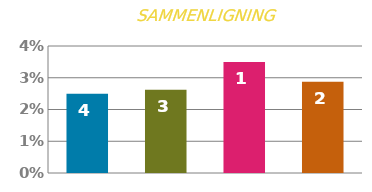
| Category | RENTE |
|---|---|
| 0 | 0.025 |
| 1 | 0.026 |
| 2 | 0.035 |
| 3 | 0.029 |